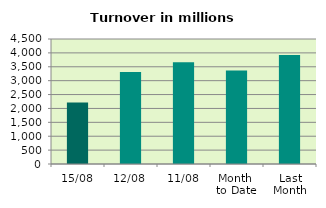
| Category | Series 0 |
|---|---|
| 15/08 | 2218.209 |
| 12/08 | 3313.231 |
| 11/08 | 3665.233 |
| Month 
to Date | 3362.273 |
| Last
Month | 3920.999 |